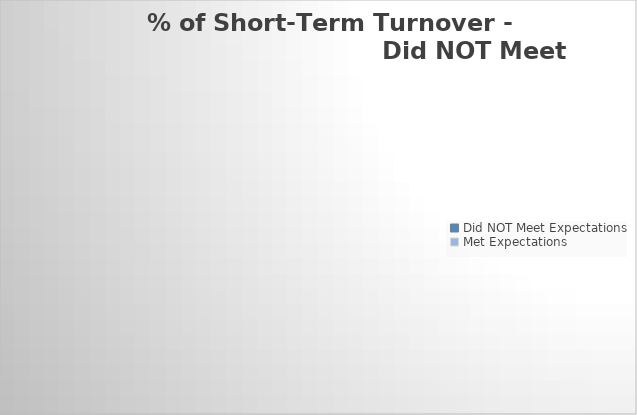
| Category | Series 0 |
|---|---|
| Did NOT Meet Expectations | 0 |
| Met Expectations | 0 |